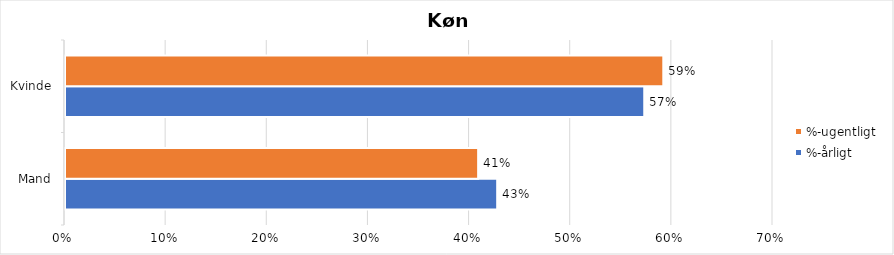
| Category | %-årligt | %-ugentligt |
|---|---|---|
| Mand | 0.427 | 0.408 |
| Kvinde | 0.573 | 0.592 |